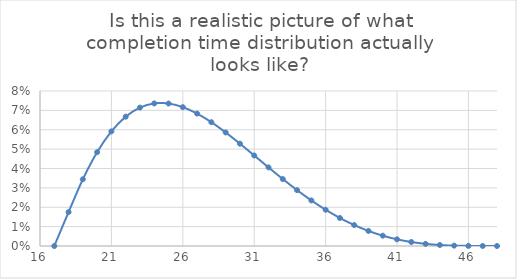
| Category | Series 0 |
|---|---|
| 17.0 | 0 |
| 18.0 | 0.017 |
| 19.0 | 0.034 |
| 20.0 | 0.048 |
| 21.0 | 0.059 |
| 22.0 | 0.067 |
| 23.0 | 0.071 |
| 24.0 | 0.074 |
| 25.0 | 0.074 |
| 26.0 | 0.072 |
| 27.0 | 0.068 |
| 28.0 | 0.064 |
| 29.0 | 0.059 |
| 30.0 | 0.053 |
| 31.0 | 0.047 |
| 32.0 | 0.041 |
| 33.0 | 0.035 |
| 34.0 | 0.029 |
| 35.0 | 0.024 |
| 36.0 | 0.019 |
| 37.0 | 0.014 |
| 38.0 | 0.011 |
| 39.0 | 0.008 |
| 40.0 | 0.005 |
| 41.0 | 0.003 |
| 42.0 | 0.002 |
| 43.0 | 0.001 |
| 44.0 | 0.001 |
| 45.0 | 0 |
| 46.0 | 0 |
| 47.0 | 0 |
| 48.0 | 0 |